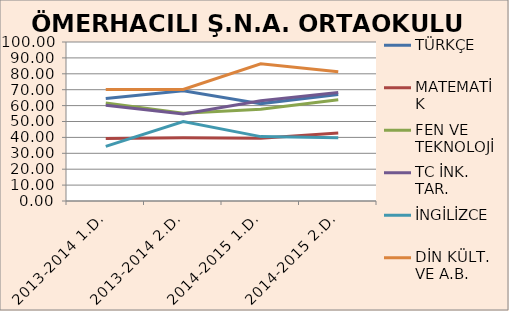
| Category | TÜRKÇE | MATEMATİK | FEN VE TEKNOLOJİ | TC İNK. TAR. | İNGİLİZCE | DİN KÜLT. VE A.B. |
|---|---|---|---|---|---|---|
| 2013-2014 1.D. | 64.4 | 39.28 | 61.63 | 60.2 | 34.4 | 70.2 |
| 2013-2014 2.D. | 69.4 | 39.8 | 55.2 | 54.8 | 50 | 70.2 |
| 2014-2015 1.D. | 61.25 | 39.5 | 57.75 | 63 | 40.5 | 86.25 |
| 2014-2015 2.D. | 67 | 42.75 | 63.75 | 68.25 | 39.75 | 81.25 |